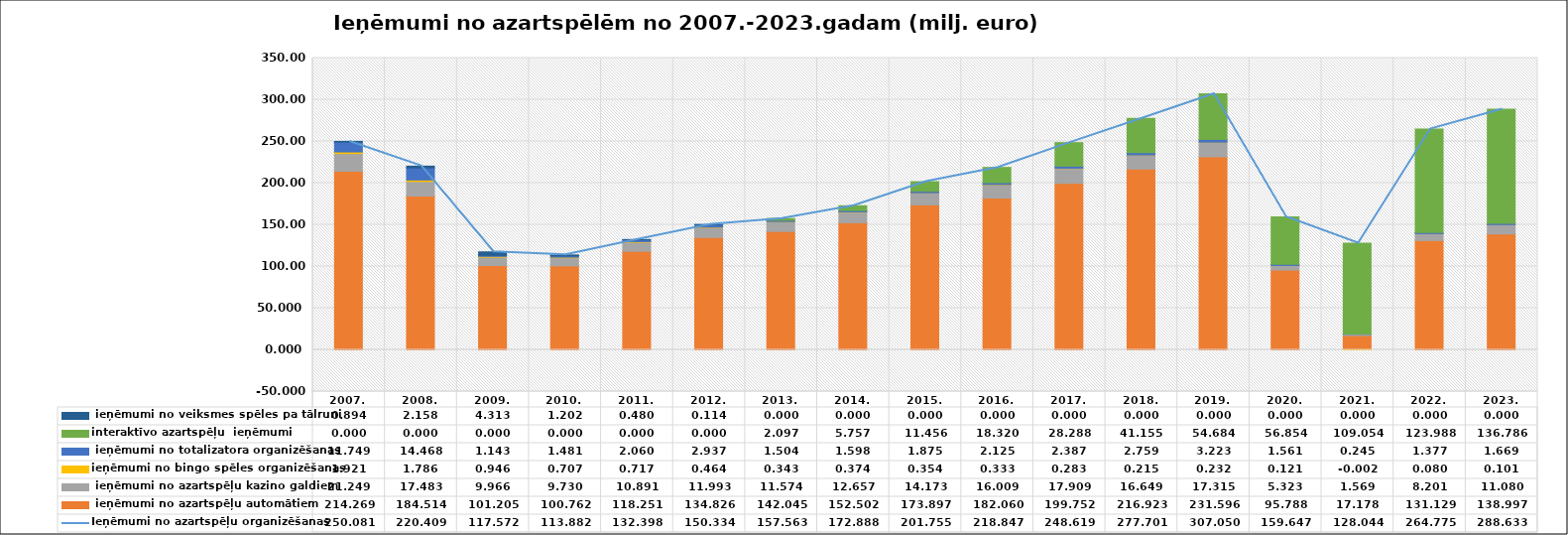
| Category |  ieņēmumi no azartspēļu automātiem |  ieņēmumi no azartspēļu kazino galdiem | ieņēmumi no bingo spēles organizēšanas |  ieņēmumi no totalizatora organizēšanas | interaktīvo azartspēļu  ieņēmumi |  ieņēmumi no veiksmes spēles pa tālruni |
|---|---|---|---|---|---|---|
| 2007. | 214.269 | 21.249 | 1.921 | 11.749 | 0 | 0.894 |
| 2008. | 184.514 | 17.483 | 1.786 | 14.468 | 0 | 2.158 |
| 2009. | 101.205 | 9.966 | 0.946 | 1.143 | 0 | 4.313 |
| 2010. | 100.762 | 9.73 | 0.707 | 1.481 | 0 | 1.202 |
| 2011. | 118.251 | 10.891 | 0.717 | 2.06 | 0 | 0.48 |
| 2012. | 134.826 | 11.993 | 0.464 | 2.937 | 0 | 0.114 |
| 2013. | 142.045 | 11.574 | 0.343 | 1.504 | 2.097 | 0 |
| 2014. | 152.502 | 12.657 | 0.374 | 1.598 | 5.757 | 0 |
| 2015. | 173.897 | 14.173 | 0.354 | 1.875 | 11.456 | 0 |
| 2016. | 182.06 | 16.009 | 0.333 | 2.125 | 18.32 | 0 |
| 2017. | 199.752 | 17.909 | 0.283 | 2.387 | 28.288 | 0 |
| 2018. | 216.923 | 16.649 | 0.215 | 2.759 | 41.155 | 0 |
| 2019. | 231.596 | 17.315 | 0.232 | 3.223 | 54.684 | 0 |
| 2020. | 95.788 | 5.323 | 0.121 | 1.561 | 56.854 | 0 |
| 2021. | 17.178 | 1.569 | -0.002 | 0.245 | 109.054 | 0 |
| 2022. | 131.129 | 8.201 | 0.08 | 1.377 | 123.988 | 0 |
| 2023. | 138.997 | 11.08 | 0.101 | 1.669 | 136.786 | 0 |